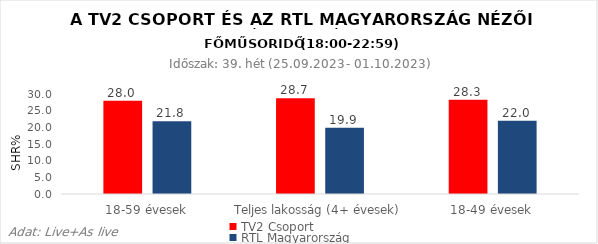
| Category | TV2 Csoport | RTL Magyarország |
|---|---|---|
| 18-59 évesek | 28 | 21.8 |
| Teljes lakosság (4+ évesek) | 28.7 | 19.9 |
| 18-49 évesek | 28.3 | 22 |